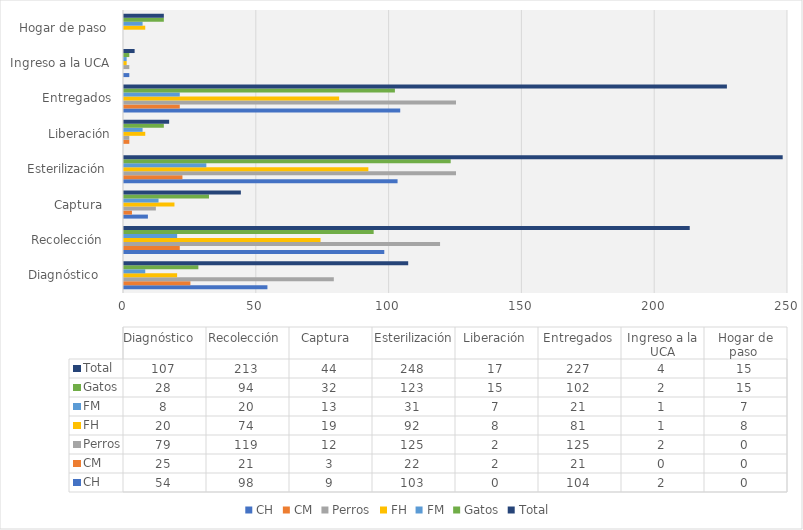
| Category | CH | CM | Perros | FH | FM | Gatos | Total  |
|---|---|---|---|---|---|---|---|
| Diagnóstico    | 54 | 25 | 79 | 20 | 8 | 28 | 107 |
| Recolección   | 98 | 21 | 119 | 74 | 20 | 94 | 213 |
| Captura   | 9 | 3 | 12 | 19 | 13 | 32 | 44 |
| Esterilización  | 103 | 22 | 125 | 92 | 31 | 123 | 248 |
| Liberación | 0 | 2 | 2 | 8 | 7 | 15 | 17 |
| Entregados | 104 | 21 | 125 | 81 | 21 | 102 | 227 |
| Ingreso a la UCA | 2 | 0 | 2 | 1 | 1 | 2 | 4 |
| Hogar de paso  | 0 | 0 | 0 | 8 | 7 | 15 | 15 |